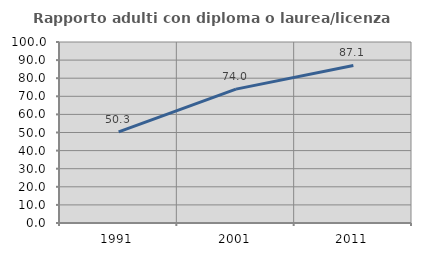
| Category | Rapporto adulti con diploma o laurea/licenza media  |
|---|---|
| 1991.0 | 50.306 |
| 2001.0 | 73.962 |
| 2011.0 | 87.057 |